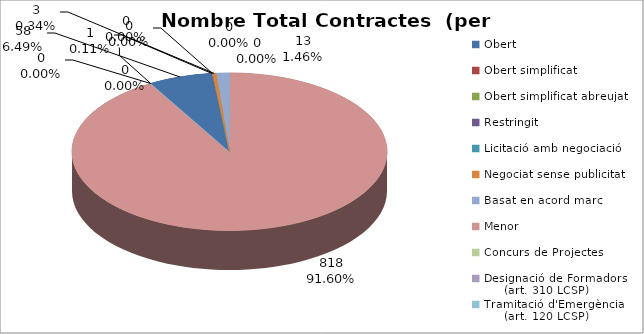
| Category | Nombre Total Contractes |
|---|---|
| Obert | 58 |
| Obert simplificat | 1 |
| Obert simplificat abreujat | 0 |
| Restringit | 0 |
| Licitació amb negociació | 0 |
| Negociat sense publicitat | 3 |
| Basat en acord marc | 13 |
| Menor | 818 |
| Concurs de Projectes | 0 |
| Designació de Formadors
     (art. 310 LCSP) | 0 |
| Tramitació d'Emergència
     (art. 120 LCSP) | 0 |